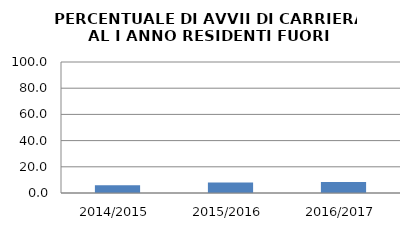
| Category | 2014/2015 2015/2016 2016/2017 |
|---|---|
| 2014/2015 | 5.882 |
| 2015/2016 | 8 |
| 2016/2017 | 8.333 |